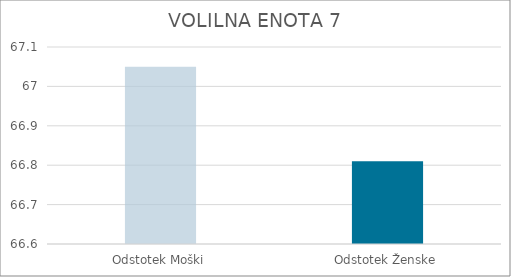
| Category | Series 0 |
|---|---|
| Odstotek Moški | 67.05 |
| Odstotek Ženske | 66.81 |